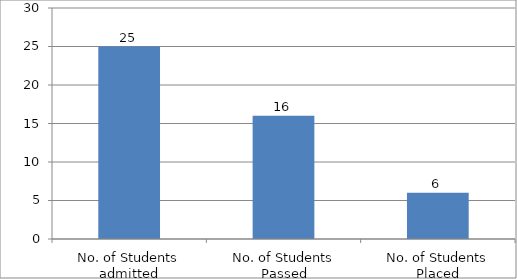
| Category | Series 0 |
|---|---|
| No. of Students admitted | 25 |
| No. of Students Passed | 16 |
| No. of Students Placed | 6 |